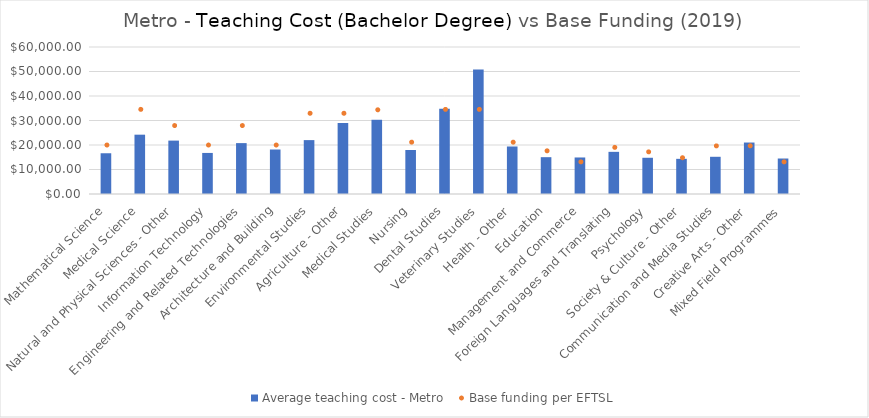
| Category | Average teaching cost - Metro  |
|---|---|
| Mathematical Science | 16631.402 |
| Medical Science | 24212.738 |
| Natural and Physical Sciences - Other | 21793.779 |
| Information Technology | 16759.877 |
| Engineering and Related Technologies | 20770.333 |
| Architecture and Building | 18160.357 |
| Environmental Studies | 21994.487 |
| Agriculture - Other | 28987.26 |
| Medical Studies | 30299.784 |
| Nursing | 17970.654 |
| Dental Studies | 34824.272 |
| Veterinary Studies | 50844.689 |
| Health - Other | 19396.475 |
| Education | 15031.503 |
| Management and Commerce | 14909.933 |
| Foreign Languages and Translating | 17205.779 |
| Psychology | 14787.517 |
| Society & Culture - Other | 14351.961 |
| Communication and Media Studies | 15187.253 |
| Creative Arts - Other | 21009.067 |
| Mixed Field Programmes | 14486.563 |